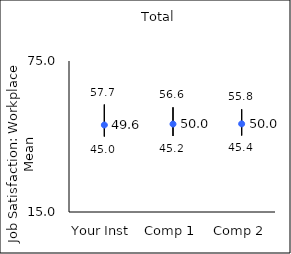
| Category | 25th percentile | 75th percentile | Mean |
|---|---|---|---|
| Your Inst | 45 | 57.7 | 49.57 |
| Comp 1 | 45.2 | 56.6 | 49.95 |
| Comp 2 | 45.4 | 55.8 | 50.03 |